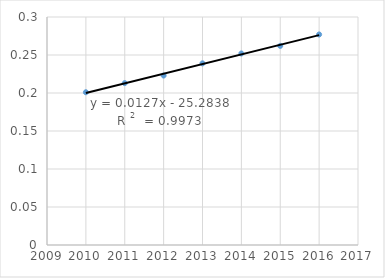
| Category | Series 0 |
|---|---|
| 2010.0 | 0.201 |
| 2011.0 | 0.213 |
| 2012.0 | 0.223 |
| 2013.0 | 0.239 |
| 2014.0 | 0.252 |
| 2015.0 | 0.262 |
| 2016.0 | 0.277 |